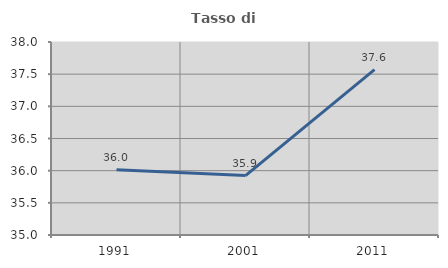
| Category | Tasso di occupazione   |
|---|---|
| 1991.0 | 36.015 |
| 2001.0 | 35.924 |
| 2011.0 | 37.571 |